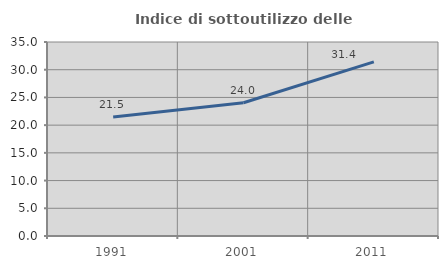
| Category | Indice di sottoutilizzo delle abitazioni  |
|---|---|
| 1991.0 | 21.477 |
| 2001.0 | 24.044 |
| 2011.0 | 31.423 |